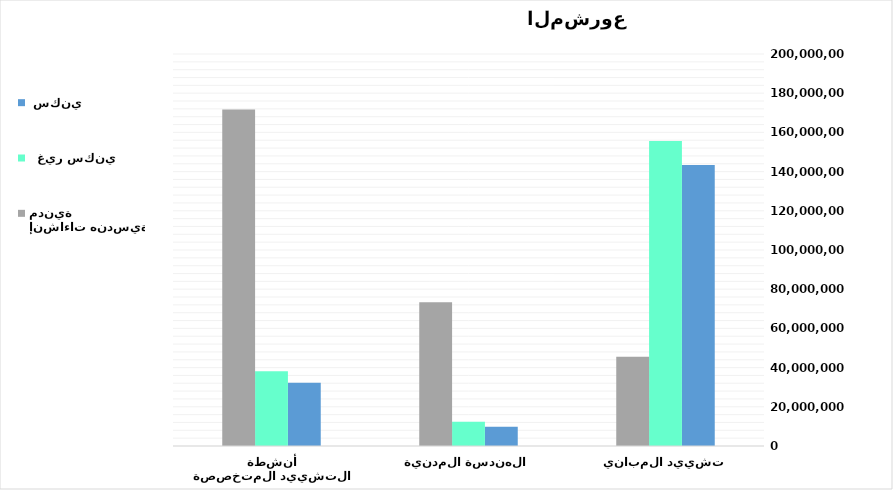
| Category |  سكني   |   غير سكني   | إنشاءات هندسية مدنية   |
|---|---|---|---|
| تشييد المباني | 143328890.25 | 155625471.75 | 45576951 |
| الهندسة المدنية | 9802607.85 | 12402511.8 | 73359269.55 |
| أنشطة التشييد المتخصصة | 32277733.95 | 38177966.4 | 171690618.75 |